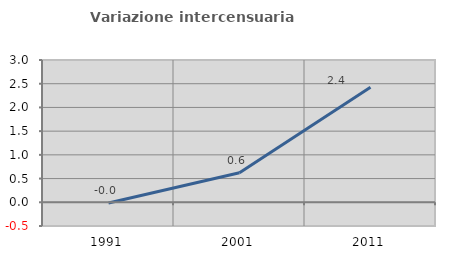
| Category | Variazione intercensuaria annua |
|---|---|
| 1991.0 | -0.015 |
| 2001.0 | 0.624 |
| 2011.0 | 2.425 |